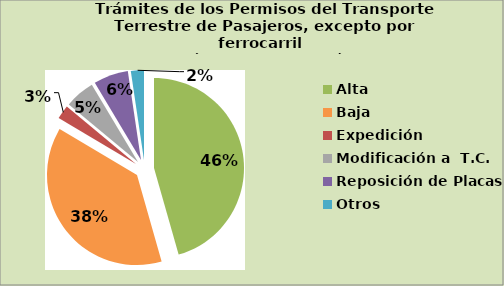
| Category | Series 0 |
|---|---|
| Alta                                         | 45.587 |
| Baja | 37.943 |
| Expedición | 2.514 |
| Modificación a  T.C. | 5.375 |
| Reposición de Placas | 6.234 |
| Otros | 2.347 |